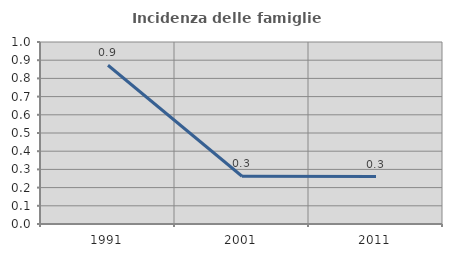
| Category | Incidenza delle famiglie numerose |
|---|---|
| 1991.0 | 0.872 |
| 2001.0 | 0.262 |
| 2011.0 | 0.26 |